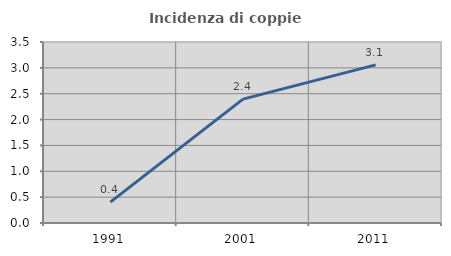
| Category | Incidenza di coppie miste |
|---|---|
| 1991.0 | 0.405 |
| 2001.0 | 2.395 |
| 2011.0 | 3.057 |